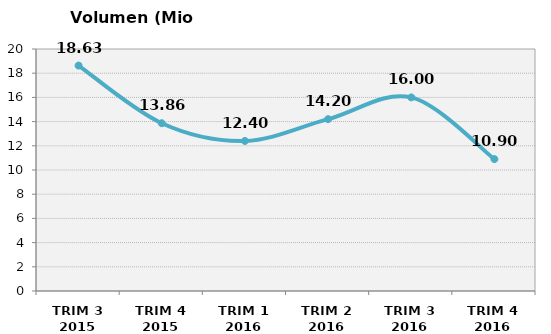
| Category | Volumen (Mio consumiciones) |
|---|---|
| TRIM 3 2015 | 18.632 |
| TRIM 4 2015 | 13.865 |
| TRIM 1 2016 | 12.4 |
| TRIM 2 2016 | 14.2 |
| TRIM 3 2016 | 16 |
| TRIM 4 2016 | 10.9 |